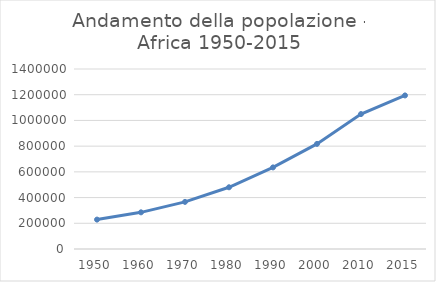
| Category | Series 0 |
|---|---|
| 1950 | 228670.019 |
| 1960 | 285142.006 |
| 1970 | 366458.929 |
| 1980 | 480012.209 |
| 1990 | 634567.044 |
| 2000 | 817566.004 |
| 2010 | 1049446.344 |
| 2015 | 1194369.908 |